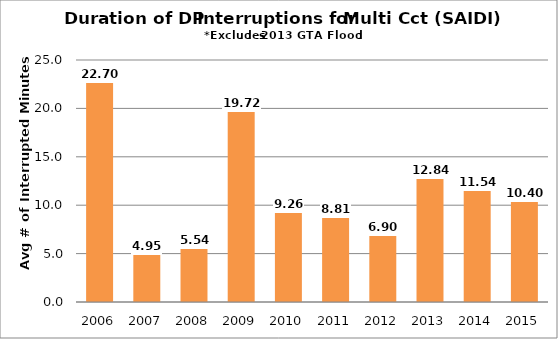
| Category | T-SAIDI-mc |
|---|---|
| 2006.0 | 22.697 |
| 2007.0 | 4.945 |
| 2008.0 | 5.543 |
| 2009.0 | 19.719 |
| 2010.0 | 9.259 |
| 2011.0 | 8.806 |
| 2012.0 | 6.902 |
| 2013.0 | 12.841 |
| 2014.0 | 11.542 |
| 2015.0 | 10.398 |